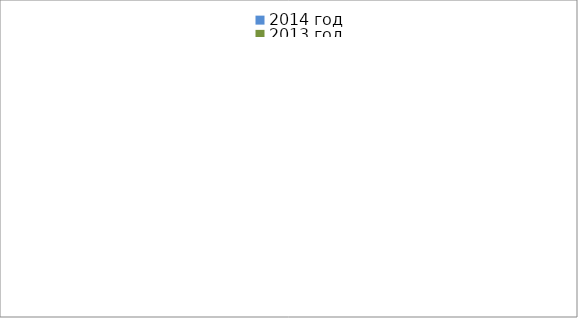
| Category | 2014 год | 2013 год |
|---|---|---|
|  - поджог | 2 | 9 |
|  - неосторожное обращение с огнём | 6 | 7 |
|  - НПТЭ электрооборудования | 2 | 10 |
|  - НПУ и Э печей | 23 | 11 |
|  - НПУ и Э транспортных средств | 20 | 22 |
|   -Шалость с огнем детей | 0 | 1 |
|  -НППБ при эксплуатации эл.приборов | 5 | 10 |
|  - курение | 1 | 1 |
| - прочие | 27 | 17 |
| - не установленные причины | 2 | 1 |